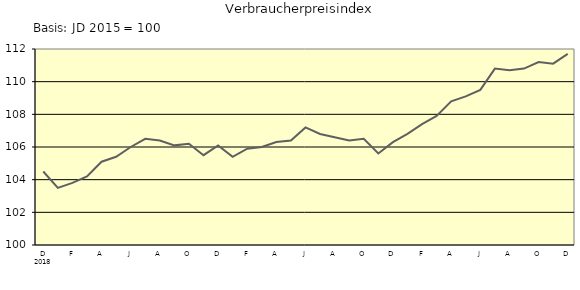
| Category | Series 0 |
|---|---|
| 0 | 104.5 |
| 1 | 103.5 |
| 2 | 103.8 |
| 3 | 104.2 |
| 4 | 105.1 |
| 5 | 105.4 |
| 6 | 106 |
| 7 | 106.5 |
| 8 | 106.4 |
| 9 | 106.1 |
| 10 | 106.2 |
| 11 | 105.5 |
| 12 | 106.1 |
| 13 | 105.4 |
| 14 | 105.9 |
| 15 | 106 |
| 16 | 106.3 |
| 17 | 106.4 |
| 18 | 107.2 |
| 19 | 106.8 |
| 20 | 106.6 |
| 21 | 106.4 |
| 22 | 106.5 |
| 23 | 105.6 |
| 24 | 106.3 |
| 25 | 106.8 |
| 26 | 107.4 |
| 27 | 107.9 |
| 28 | 108.8 |
| 29 | 109.1 |
| 30 | 109.5 |
| 31 | 110.8 |
| 32 | 110.7 |
| 33 | 110.8 |
| 34 | 111.2 |
| 35 | 111.1 |
| 36 | 111.7 |